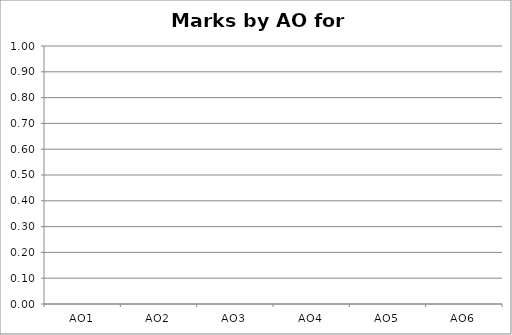
| Category | Student 1 |
|---|---|
| AO1 | 0 |
| AO2 | 0 |
| AO3 | 0 |
| AO4 | 0 |
| AO5 | 0 |
| AO6 | 0 |